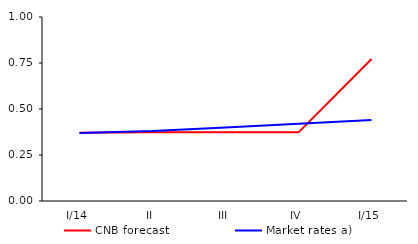
| Category | CNB forecast | Market rates a) |
|---|---|---|
| I/14 | 0.372 | 0.37 |
| II | 0.373 | 0.38 |
| III | 0.373 | 0.4 |
| IV | 0.373 | 0.42 |
| I/15 | 0.772 | 0.44 |